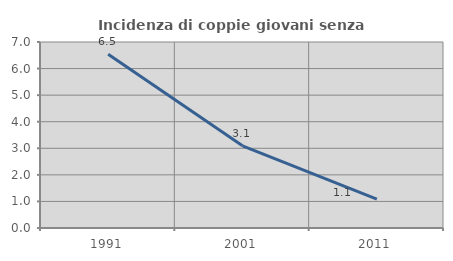
| Category | Incidenza di coppie giovani senza figli |
|---|---|
| 1991.0 | 6.542 |
| 2001.0 | 3.093 |
| 2011.0 | 1.087 |